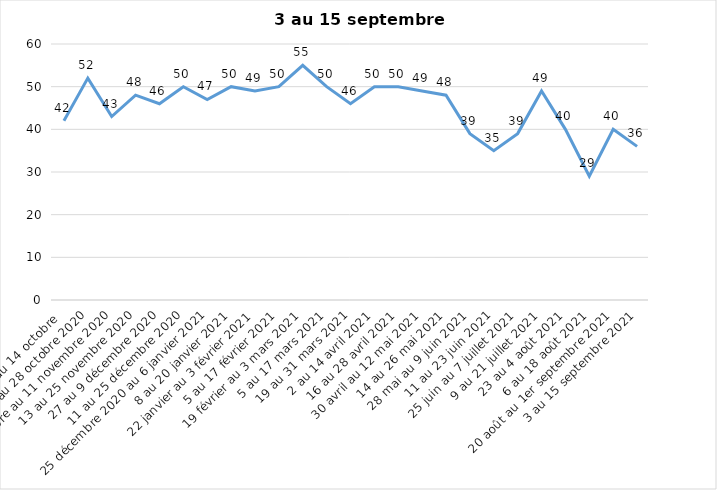
| Category | Toujours aux trois mesures |
|---|---|
| 2 au 14 octobre  | 42 |
| 16 au 28 octobre 2020 | 52 |
| 30 octobre au 11 novembre 2020 | 43 |
| 13 au 25 novembre 2020 | 48 |
| 27 au 9 décembre 2020 | 46 |
| 11 au 25 décembre 2020 | 50 |
| 25 décembre 2020 au 6 janvier 2021 | 47 |
| 8 au 20 janvier 2021 | 50 |
| 22 janvier au 3 février 2021 | 49 |
| 5 au 17 février 2021 | 50 |
| 19 février au 3 mars 2021 | 55 |
| 5 au 17 mars 2021 | 50 |
| 19 au 31 mars 2021 | 46 |
| 2 au 14 avril 2021 | 50 |
| 16 au 28 avril 2021 | 50 |
| 30 avril au 12 mai 2021 | 49 |
| 14 au 26 mai 2021 | 48 |
| 28 mai au 9 juin 2021 | 39 |
| 11 au 23 juin 2021 | 35 |
| 25 juin au 7 juillet 2021 | 39 |
| 9 au 21 juillet 2021 | 49 |
| 23 au 4 août 2021 | 40 |
| 6 au 18 août 2021 | 29 |
| 20 août au 1er septembre 2021 | 40 |
| 3 au 15 septembre 2021 | 36 |